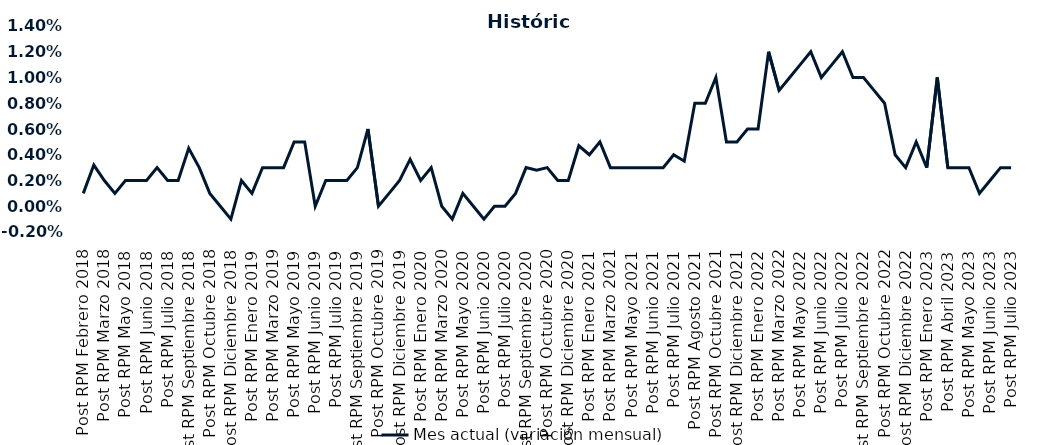
| Category | Mes actual (variación mensual)  |
|---|---|
| Post RPM Febrero 2018 | 0.001 |
| Pre RPM Marzo 2018 | 0.003 |
| Post RPM Marzo 2018 | 0.002 |
| Pre RPM Mayo 2018 | 0.001 |
| Post RPM Mayo 2018 | 0.002 |
| Pre RPM Junio 2018 | 0.002 |
| Post RPM Junio 2018 | 0.002 |
| Pre RPM Julio 2018 | 0.003 |
| Post RPM Julio 2018 | 0.002 |
| Pre RPM Septiembre 2018 | 0.002 |
| Post RPM Septiembre 2018 | 0.004 |
| Pre RPM Octubre 2018 | 0.003 |
| Post RPM Octubre 2018 | 0.001 |
| Pre RPM Diciembre 2018 | 0 |
| Post RPM Diciembre 2018 | -0.001 |
| Pre RPM Enero 2019 | 0.002 |
| Post RPM Enero 2019 | 0.001 |
| Pre RPM Marzo 2019 | 0.003 |
| Post RPM Marzo 2019 | 0.003 |
| Pre RPM Mayo 2019 | 0.003 |
| Post RPM Mayo 2019 | 0.005 |
| Pre RPM Junio 2019 | 0.005 |
| Post RPM Junio 2019 | 0 |
| Pre RPM Julio 2019 | 0.002 |
| Post RPM Julio 2019 | 0.002 |
| Pre RPM Septiembre 2019 | 0.002 |
| Post RPM Septiembre 2019 | 0.003 |
| Pre RPM Octubre 2019 | 0.006 |
| Post RPM Octubre 2019 | 0 |
| Pre RPM Diciembre 2019 | 0.001 |
| Post RPM Diciembre 2019 | 0.002 |
| Pre RPM Enero 2020 | 0.004 |
| Post RPM Enero 2020 | 0.002 |
| Pre RPM Marzo 2020 | 0.003 |
| Post RPM Marzo 2020 | 0 |
| Pre RPM Mayo 2020 | -0.001 |
| Post RPM Mayo 2020 | 0.001 |
| Pre RPM Junio 2020 | 0 |
| Post RPM Junio 2020 | -0.001 |
| Pre RPM Julio 2020 | 0 |
| Post RPM Julio 2020 | 0 |
| Pre RPM Septiembre 2020 | 0.001 |
| Post RPM Septiembre 2020 | 0.003 |
| Pre RPM Octubre 2020 | 0.003 |
| Post RPM Octubre 2020 | 0.003 |
| Pre RPM Diciembre 2020 | 0.002 |
| Post RPM Diciembre 2020 | 0.002 |
| Pre RPM Enero 2021 | 0.005 |
| Post RPM Enero 2021 | 0.004 |
| Pre RPM Marzo 2021 | 0.005 |
| Post RPM Marzo 2021 | 0.003 |
| Pre RPM Mayo 2021 | 0.003 |
| Post RPM Mayo 2021 | 0.003 |
| Pre RPM Junio 2021 | 0.003 |
| Post RPM Junio 2021 | 0.003 |
| Pre RPM Julio 2021 | 0.003 |
| Post RPM Julio 2021 | 0.004 |
| Pre RPM Agosto 2021 | 0.004 |
| Post RPM Agosto 2021 | 0.008 |
| Pre RPM Octubre 2021 | 0.008 |
| Post RPM Octubre 2021 | 0.01 |
| Pre RPM Diciembre 2021 | 0.005 |
| Post RPM Diciembre 2021 | 0.005 |
| Pre RPM Enero 2022 | 0.006 |
| Post RPM Enero 2022 | 0.006 |
| Pre RPM Marzo 2022 | 0.012 |
| Post RPM Marzo 2022 | 0.009 |
| Pre RPM Mayo 2022 | 0.01 |
| Post RPM Mayo 2022 | 0.011 |
| Pre RPM Junio 2022 | 0.012 |
| Post RPM Junio 2022 | 0.01 |
| Pre RPM Julio 2022 | 0.011 |
| Post RPM Julio 2022 | 0.012 |
| Pre RPM Septiembre 2022 | 0.01 |
| Post RPM Septiembre 2022 | 0.01 |
| Pre RPM Octubre 2022 | 0.009 |
| Post RPM Octubre 2022 | 0.008 |
| Pre RPM Diciembre 2022 | 0.004 |
| Post RPM Diciembre 2022 | 0.003 |
| Pre RPM Enero 2023 | 0.005 |
| Post RPM Enero 2023 | 0.003 |
| Pre RPM Abril 2023 | 0.01 |
| Post RPM Abril 2023 | 0.003 |
| Pre RPM Mayo 2023 | 0.003 |
| Post RPM Mayo 2023 | 0.003 |
| Pre RPM Junio 2023 | 0.001 |
| Post RPM Junio 2023 | 0.002 |
| Pre RPM Julio 2023 | 0.003 |
| Post RPM Julio 2023 | 0.003 |